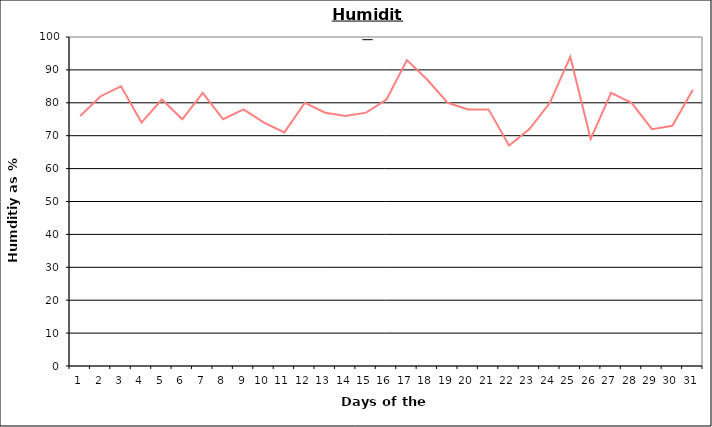
| Category | Series 0 |
|---|---|
| 0 | 76 |
| 1 | 82 |
| 2 | 85 |
| 3 | 74 |
| 4 | 81 |
| 5 | 75 |
| 6 | 83 |
| 7 | 75 |
| 8 | 78 |
| 9 | 74 |
| 10 | 71 |
| 11 | 80 |
| 12 | 77 |
| 13 | 76 |
| 14 | 77 |
| 15 | 81 |
| 16 | 93 |
| 17 | 87 |
| 18 | 80 |
| 19 | 78 |
| 20 | 78 |
| 21 | 67 |
| 22 | 72 |
| 23 | 80 |
| 24 | 94 |
| 25 | 69 |
| 26 | 83 |
| 27 | 80 |
| 28 | 72 |
| 29 | 73 |
| 30 | 84 |